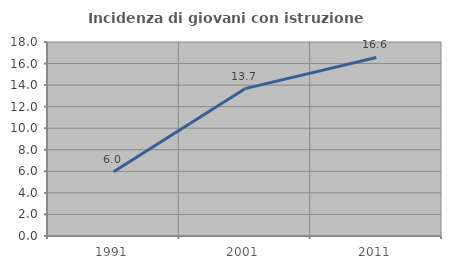
| Category | Incidenza di giovani con istruzione universitaria |
|---|---|
| 1991.0 | 5.963 |
| 2001.0 | 13.672 |
| 2011.0 | 16.566 |